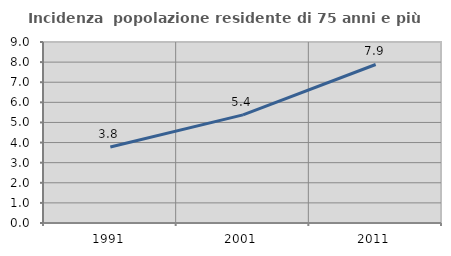
| Category | Incidenza  popolazione residente di 75 anni e più |
|---|---|
| 1991.0 | 3.777 |
| 2001.0 | 5.378 |
| 2011.0 | 7.881 |